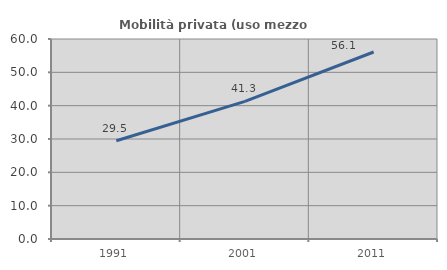
| Category | Mobilità privata (uso mezzo privato) |
|---|---|
| 1991.0 | 29.487 |
| 2001.0 | 41.279 |
| 2011.0 | 56.098 |